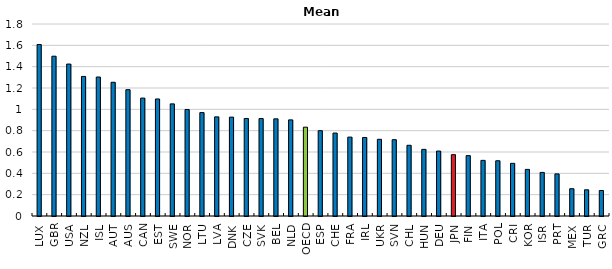
| Category | Mean index |
|---|---|
| LUX | 1.608 |
| GBR | 1.498 |
| USA | 1.425 |
| NZL | 1.308 |
| ISL | 1.303 |
| AUT | 1.254 |
| AUS | 1.184 |
| CAN | 1.105 |
| EST | 1.097 |
| SWE | 1.051 |
| NOR | 0.999 |
| LTU | 0.969 |
| LVA | 0.929 |
| DNK | 0.927 |
| CZE | 0.914 |
| SVK | 0.914 |
| BEL | 0.911 |
| NLD | 0.901 |
| OECD | 0.833 |
| ESP | 0.8 |
| CHE | 0.778 |
| FRA | 0.74 |
| IRL | 0.736 |
| UKR | 0.719 |
| SVN | 0.715 |
| CHL | 0.663 |
| HUN | 0.625 |
| DEU | 0.609 |
| JPN | 0.575 |
| FIN | 0.566 |
| ITA | 0.522 |
| POL | 0.518 |
| CRI | 0.494 |
| KOR | 0.437 |
| ISR | 0.409 |
| PRT | 0.395 |
| MEX | 0.256 |
| TUR | 0.246 |
| GRC | 0.239 |